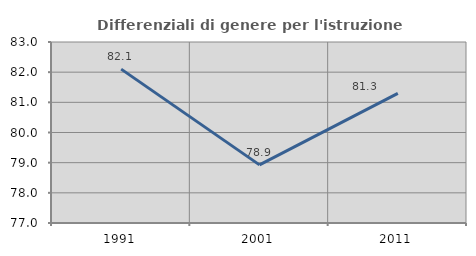
| Category | Differenziali di genere per l'istruzione superiore |
|---|---|
| 1991.0 | 82.101 |
| 2001.0 | 78.927 |
| 2011.0 | 81.297 |